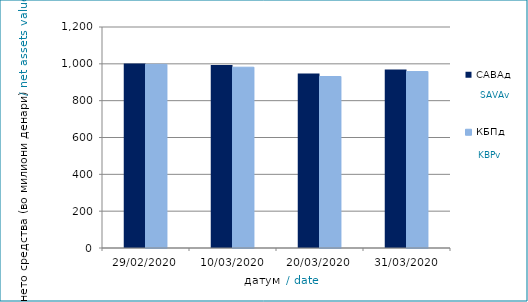
| Category | САВАд | КБПд |
|---|---|---|
| 29/02/2020 | 1001.832 | 997.203 |
| 10/03/2020 | 994.237 | 981.777 |
| 20/03/2020 | 947.691 | 931.174 |
| 31/03/2020 | 969.513 | 958.09 |